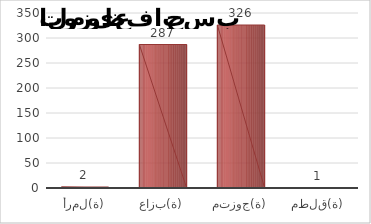
| Category | Series 1 |
|---|---|
| أرمل(ة) | 2 |
| عازب(ة) | 287 |
| متزوج(ة) | 326 |
| مطلق(ة) | 1 |